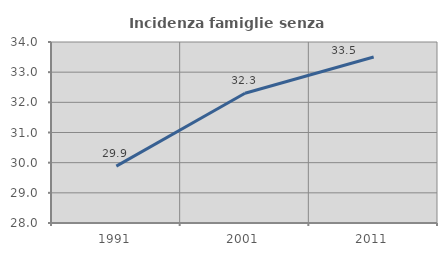
| Category | Incidenza famiglie senza nuclei |
|---|---|
| 1991.0 | 29.884 |
| 2001.0 | 32.302 |
| 2011.0 | 33.502 |